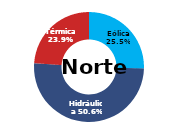
| Category | Norte |
|---|---|
| Eólica | 82.14 |
| Hidráulica | 163.339 |
| Solar | 0 |
| Térmica | 77.051 |